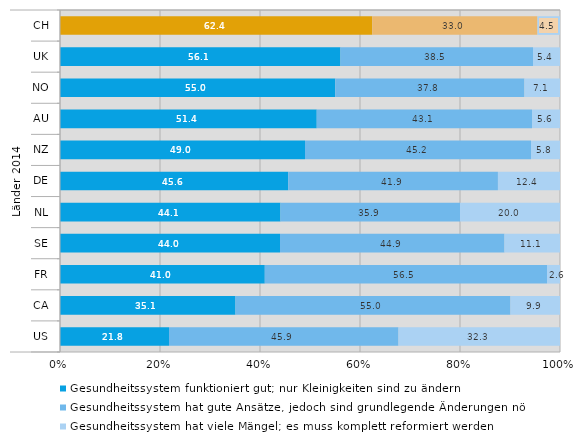
| Category | Gesundheitssystem funktioniert gut; nur Kleinigkeiten sind zu ändern | Gesundheitssystem hat gute Ansätze, jedoch sind grundlegende Änderungen nötig | Gesundheitssystem hat viele Mängel; es muss komplett reformiert werden |
|---|---|---|---|
| 0 | 62.4 | 33 | 4.5 |
| 1 | 56.1 | 38.5 | 5.4 |
| 2 | 55 | 37.8 | 7.1 |
| 3 | 51.4 | 43.1 | 5.6 |
| 4 | 49 | 45.2 | 5.8 |
| 5 | 45.6 | 41.9 | 12.4 |
| 6 | 44.1 | 35.9 | 20 |
| 7 | 44 | 44.9 | 11.1 |
| 8 | 41 | 56.5 | 2.6 |
| 9 | 35.1 | 55 | 9.9 |
| 10 | 21.8 | 45.9 | 32.3 |